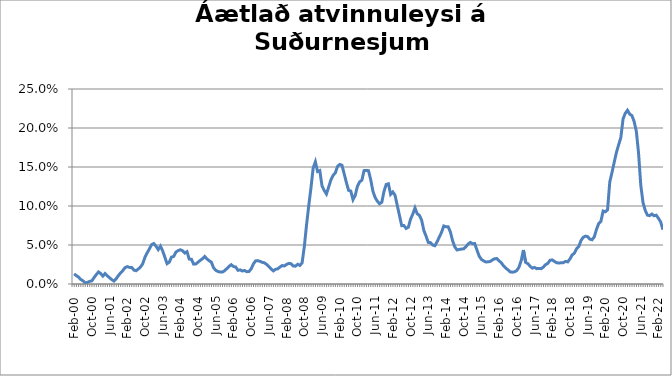
| Category | Series 0 |
|---|---|
| feb.00 | 0.013 |
| mar.00 | 0.011 |
| apr.00 | 0.009 |
| maí.00 | 0.006 |
| jún.00 | 0.004 |
| júl.00 | 0.002 |
| ágú.00 | 0.002 |
| sep.00 | 0.003 |
| okt.00 | 0.004 |
| nóv.00 | 0.008 |
| des.00 | 0.012 |
| jan.01 | 0.015 |
| feb.01 | 0.013 |
| mar.01 | 0.01 |
| apr.01 | 0.013 |
| maí.01 | 0.011 |
| jún.01 | 0.008 |
| júl.01 | 0.006 |
| ágú.01 | 0.004 |
| sep.01 | 0.007 |
| okt.01 | 0.011 |
| nóv.01 | 0.014 |
| des.01 | 0.017 |
| jan.02 | 0.021 |
| feb.02 | 0.022 |
| mar.02 | 0.021 |
| apr.02 | 0.021 |
| maí.02 | 0.018 |
| jún.02 | 0.017 |
| júl.02 | 0.019 |
| ágú.02 | 0.022 |
| sep.02 | 0.026 |
| okt.02 | 0.034 |
| nóv.02 | 0.04 |
| des.02 | 0.045 |
| jan.03 | 0.05 |
| feb.03 | 0.052 |
| mar.03 | 0.049 |
| apr.03 | 0.044 |
| maí.03 | 0.049 |
| jún.03 | 0.043 |
| júl.03 | 0.034 |
| ágú.03 | 0.026 |
| sep.03 | 0.028 |
| okt.03 | 0.034 |
| nóv.03 | 0.035 |
| des.03 | 0.041 |
| jan.04 | 0.043 |
| feb.04 | 0.044 |
| mar.04 | 0.043 |
| apr.04 | 0.04 |
| maí.04 | 0.041 |
| jún.04 | 0.032 |
| júl.04 | 0.032 |
| ágú.04 | 0.026 |
| sep.04 | 0.026 |
| okt.04 | 0.028 |
| nóv.04 | 0.03 |
| des.04 | 0.032 |
| jan.05 | 0.035 |
| feb.05 | 0.032 |
| mar.05 | 0.03 |
| apr.05 | 0.028 |
| maí.05 | 0.021 |
| jún.05 | 0.018 |
| júl.05 | 0.016 |
| ágú.05 | 0.015 |
| sep.05 | 0.015 |
| okt.05 | 0.017 |
| nóv.05 | 0.02 |
| des.05 | 0.023 |
| jan.06 | 0.025 |
| feb.06 | 0.022 |
| mar.06 | 0.022 |
| apr.06 | 0.018 |
| maí.06 | 0.018 |
| jún.06 | 0.017 |
| júl.06 | 0.017 |
| ágú.06 | 0.016 |
| sep.06 | 0.016 |
| okt.06 | 0.019 |
| nóv.06 | 0.026 |
| des.06 | 0.03 |
| jan.07 | 0.03 |
| feb.07 | 0.029 |
| mar.07 | 0.028 |
| apr.07 | 0.027 |
| maí.07 | 0.025 |
| jún.07 | 0.022 |
| júl.07 | 0.019 |
| ágú.07 | 0.017 |
| sep.07 | 0.019 |
| okt.07 | 0.02 |
| nóv.07 | 0.022 |
| des.07 | 0.024 |
| jan.08 | 0.023 |
| feb.08 | 0.025 |
| mar.08 | 0.026 |
| apr.08 | 0.026 |
| maí.08 | 0.023 |
| jún.08 | 0.023 |
| júl.08 | 0.025 |
| ágú.08 | 0.024 |
| sep.08 | 0.027 |
| okt.08 | 0.048 |
| nóv.08 | 0.075 |
| des.08 | 0.1 |
| jan.09 | 0.123 |
| feb.09 | 0.149 |
| mar.09 | 0.157 |
| apr.09 | 0.144 |
| maí.09 | 0.145 |
| jún.09 | 0.126 |
| júl.09 | 0.12 |
| ágú.09 | 0.115 |
| sep.09 | 0.124 |
| okt.09 | 0.133 |
| nóv.09 | 0.139 |
| des.09 | 0.142 |
| jan.10 | 0.151 |
| feb.10 | 0.153 |
| mar.10 | 0.152 |
| apr.10 | 0.141 |
| maí.10 | 0.13 |
| jún.10 | 0.12 |
| júl.10 | 0.119 |
| ágú.10 | 0.108 |
| sep.10 | 0.114 |
| okt.10 | 0.125 |
| nóv.10 | 0.131 |
| des.10 | 0.133 |
| jan.11 | 0.145 |
| feb.11 | 0.146 |
| mar.11 | 0.145 |
| apr.11 | 0.134 |
| maí.11 | 0.119 |
| jún.11 | 0.111 |
| júl.11 | 0.106 |
| ágú.11 | 0.103 |
| sep.11 | 0.105 |
| okt.11 | 0.119 |
| nóv.11 | 0.128 |
| des.11 | 0.128 |
| jan.12 | 0.115 |
| feb.12 | 0.118 |
| mar.12 | 0.114 |
| apr.12 | 0.101 |
| maí.12 | 0.088 |
| jún.12 | 0.075 |
| júl.12 | 0.075 |
| ágú.12 | 0.071 |
| sep.12 | 0.073 |
| okt.12 | 0.083 |
| nóv.12 | 0.09 |
| des.12 | 0.098 |
| jan.13 | 0.09 |
| feb.13 | 0.088 |
| mar.13 | 0.082 |
| apr.13 | 0.069 |
| maí.13 | 0.061 |
| jún.13 | 0.053 |
| júl.13 | 0.053 |
| ágú.13 | 0.05 |
| sep.13 | 0.049 |
| okt.13 | 0.054 |
| nóv.13 | 0.06 |
| des.13 | 0.066 |
| jan.14 | 0.074 |
| feb.14 | 0.073 |
| mar.14 | 0.073 |
| apr.14 | 0.067 |
| maí.14 | 0.055 |
| jún.14 | 0.048 |
| júl.14 | 0.044 |
| ágú.14 | 0.044 |
| sep.14 | 0.045 |
| okt.14 | 0.045 |
| nóv.14*** | 0.048 |
| des.14 | 0.051 |
| jan.15 | 0.053 |
| feb.15 | 0.052 |
| mar.15 | 0.052 |
| apr.15 | 0.044 |
| maí.15 | 0.036 |
| jún.15 | 0.032 |
| júl.15 | 0.03 |
| ágú.15 | 0.028 |
| sep.15 | 0.028 |
| okt.15 | 0.029 |
| nóv.15 | 0.031 |
| des.15 | 0.032 |
| jan.16 | 0.033 |
| feb.16 | 0.03 |
| mar.16 | 0.027 |
| apr.16 | 0.023 |
| maí.16 | 0.02 |
| jún.16 | 0.018 |
| júl.16 | 0.015 |
| ágú.16 | 0.015 |
| sep.16 | 0.016 |
| okt.16 | 0.017 |
| nóv.16 | 0.022 |
| des.16 | 0.03 |
| jan.17 | 0.044 |
| feb.17 | 0.028 |
| mar.17 | 0.026 |
| apr.17 | 0.023 |
| maí.17 | 0.02 |
| jún.17 | 0.021 |
| júl.17 | 0.02 |
| ágú.17 | 0.02 |
| sep.17 | 0.02 |
| okt.17 | 0.022 |
| nóv.17 | 0.025 |
| des.17 | 0.026 |
| jan.18 | 0.03 |
| feb.18 | 0.031 |
| mar.18 | 0.029 |
| apr.18 | 0.027 |
| maí.18 | 0.027 |
| jún.18 | 0.027 |
| júl.18 | 0.027 |
| ágú.18 | 0.029 |
| sep.18 | 0.028 |
| okt.18 | 0.032 |
| nóv.18 | 0.037 |
| des.18 | 0.039 |
| jan.19 | 0.045 |
| feb.19 | 0.048 |
| mar.19 | 0.056 |
| apr.19 | 0.06 |
| maí.19 | 0.061 |
| jún.19 | 0.061 |
| júl.19 | 0.057 |
| ágú.19 | 0.057 |
| sep.19 | 0.06 |
| okt.19 | 0.07 |
| nóv.19 | 0.078 |
| des.19 | 0.08 |
| jan.20 | 0.094 |
| feb.20 | 0.093 |
| mars 2020* | 0.095 |
| apr.20 | 0.131 |
| maí.20 | 0.143 |
| jún.20 | 0.156 |
| júl.20 | 0.169 |
| ágú.20 | 0.178 |
| sep.20 | 0.188 |
| okt.20 | 0.212 |
| nóv.20 | 0.219 |
| des.20 | 0.223 |
| jan.21 | 0.218 |
| feb.21 | 0.216 |
| mar.21 | 0.208 |
| apr.21 | 0.196 |
| maí.21 | 0.168 |
| jún.21 | 0.127 |
| júl.21 | 0.105 |
| ágú.21 | 0.094 |
| sep.21 | 0.088 |
| okt.21 | 0.088 |
| nóv.21 | 0.09 |
| des.21 | 0.088 |
| jan.22 | 0.088 |
| feb.22 | 0.084 |
| mar.22 | 0.08 |
| apr.22 | 0.07 |